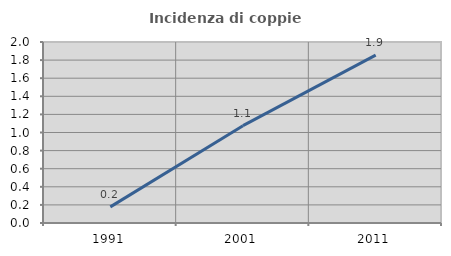
| Category | Incidenza di coppie miste |
|---|---|
| 1991.0 | 0.178 |
| 2001.0 | 1.075 |
| 2011.0 | 1.856 |